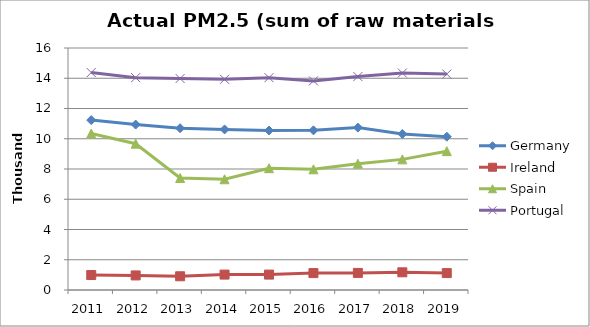
| Category | Germany | Ireland | Spain | Portugal |
|---|---|---|---|---|
| 2011 | 11233.1 | 989.55 | 10347.33 | 14375.1 |
| 2012 | 10937.34 | 963.46 | 9672.92 | 14038.5 |
| 2013 | 10695.34 | 907.77 | 7404.32 | 13983.3 |
| 2014 | 10614.69 | 1018.63 | 7321.92 | 13931.7 |
| 2015 | 10545.95 | 1018.8 | 8051.78 | 14037.5 |
| 2016 | 10557.34 | 1117.72 | 7978.6 | 13826.7 |
| 2017 | 10735.61 | 1129.11 | 8351.45 | 14113.6 |
| 2018 | 10313.46 | 1169.86 | 8636.74 | 14345.5 |
| 2019 | 10135.05 | 1118.05 | 9179.14 | 14278.1 |